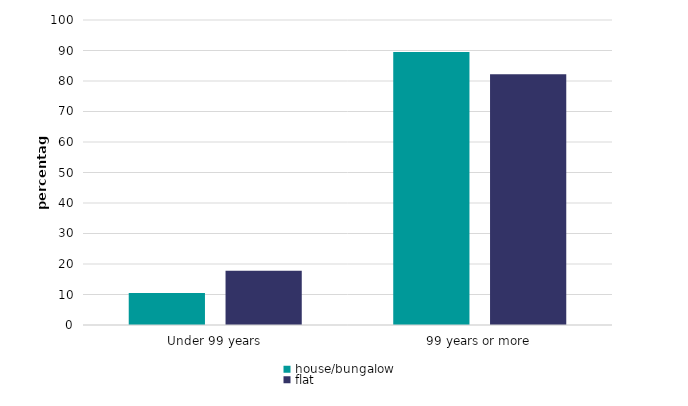
| Category | house/bungalow | flat |
|---|---|---|
| Under 99 years | 10.513 | 17.76 |
| 99 years or more | 89.487 | 82.24 |